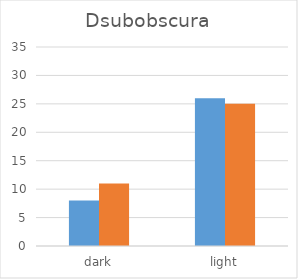
| Category | male | female |
|---|---|---|
| dark | 8 | 11 |
| light | 26 | 25 |